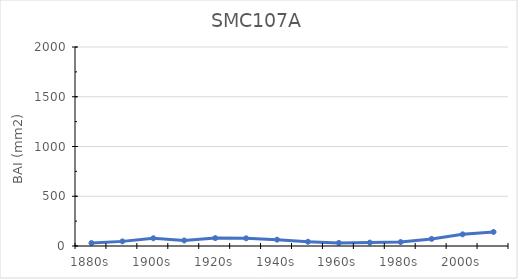
| Category | BAI |
|---|---|
| 1880s | 30.092 |
| 1890s | 46.47 |
| 1900s | 77.725 |
| 1910s | 55.463 |
| 1920s | 79.191 |
| 1930s | 77.246 |
| 1940s | 63.688 |
| 1950s | 42.829 |
| 1960s | 31.359 |
| 1970s | 34.185 |
| 1980s | 39.718 |
| 1990s | 71.308 |
| 2000s | 117.016 |
| 2010s | 141.235 |